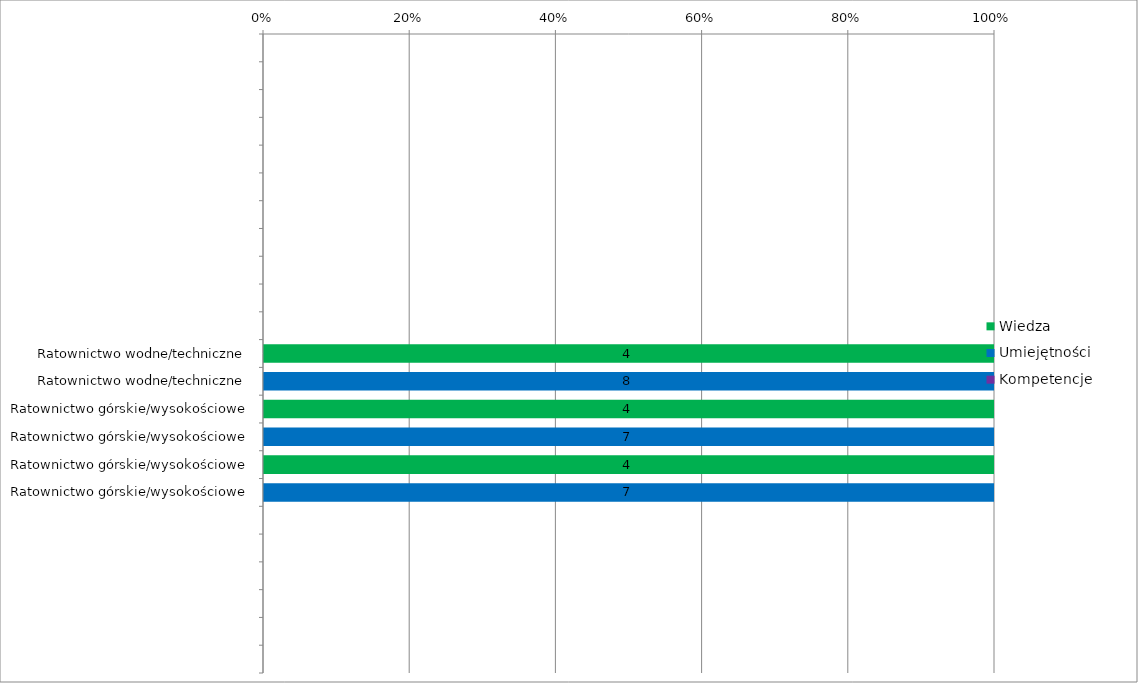
| Category | Wiedza | Umiejętności | Kompetencje |
|---|---|---|---|
|  | 0 | 0 | 0 |
|  | 0 | 0 | 0 |
|  | 0 | 0 | 0 |
|  | 0 | 0 | 0 |
|  | 0 | 0 | 0 |
|  | 0 | 0 | 0 |
|  | 0 | 0 | 0 |
|  | 0 | 0 | 0 |
|  | 0 | 0 | 0 |
|  | 0 | 0 | 0 |
|  | 0 | 0 | 0 |
| Ratownictwo wodne/techniczne | 4 | 0 | 0 |
| Ratownictwo wodne/techniczne | 0 | 8 | 0 |
| Ratownictwo górskie/wysokościowe | 4 | 0 | 0 |
| Ratownictwo górskie/wysokościowe | 0 | 7 | 0 |
| Ratownictwo górskie/wysokościowe | 4 | 0 | 0 |
| Ratownictwo górskie/wysokościowe | 0 | 7 | 0 |